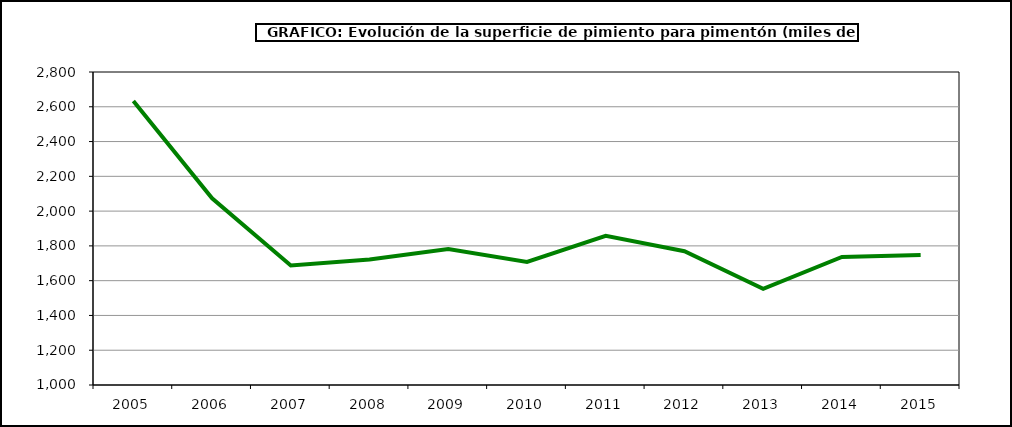
| Category | Superficie |
|---|---|
| 2005.0 | 2633 |
| 2006.0 | 2074 |
| 2007.0 | 1687 |
| 2008.0 | 1722 |
| 2009.0 | 1782 |
| 2010.0 | 1708 |
| 2011.0 | 1858 |
| 2012.0 | 1769 |
| 2013.0 | 1553 |
| 2014.0 | 1736 |
| 2015.0 | 1747 |